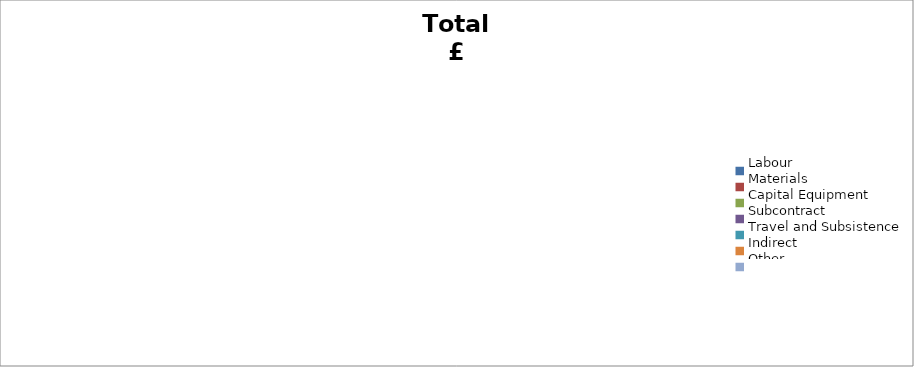
| Category | Total
£ |
|---|---|
| Labour | 0 |
| Materials | 0 |
| Capital Equipment | 0 |
| Subcontract | 0 |
| Travel and Subsistence | 0 |
| Indirect | 0 |
| Other | 0 |